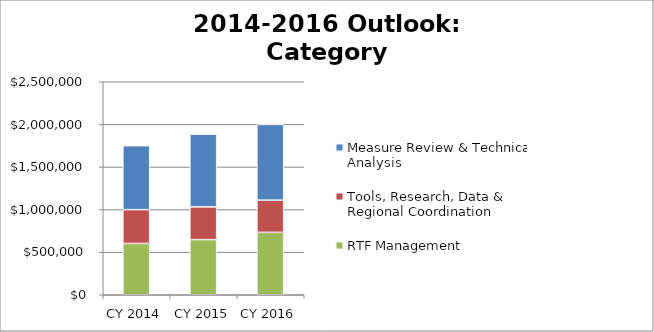
| Category | RTF Management | Tools, Research, Data & Regional Coordination | Measure Review & Technical Analysis |
|---|---|---|---|
| CY 2014 | 602000 | 397000 | 751100 |
| CY 2015 | 647314 | 384349 | 853016.5 |
| CY 2016 | 732269 | 378528.4 | 888269.5 |